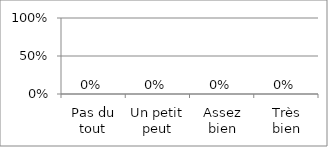
| Category | Series 0 |
|---|---|
| Pas du tout | 0 |
| Un petit peut | 0 |
| Assez bien | 0 |
| Très bien | 0 |